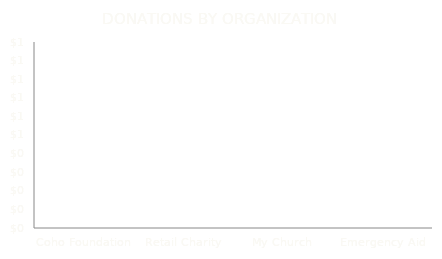
| Category | Donation |
|---|---|
| Coho Foundation | 500 |
| Retail Charity | 750 |
| My Church | 1000 |
| Emergency Aid | 525 |